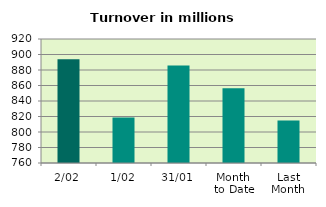
| Category | Series 0 |
|---|---|
| 2/02 | 893.882 |
| 1/02 | 818.865 |
| 31/01 | 885.862 |
| Month 
to Date | 856.373 |
| Last
Month | 814.821 |